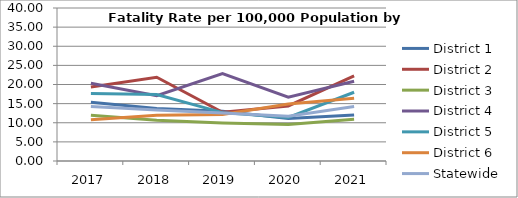
| Category | District 1 | District 2 | District 3 | District 4 | District 5 | District 6 | Statewide |
|---|---|---|---|---|---|---|---|
| 2017.0 | 15.329 | 19.351 | 11.976 | 20.334 | 17.663 | 10.802 | 14.269 |
| 2018.0 | 13.738 | 21.883 | 10.661 | 17.08 | 17.395 | 11.941 | 13.339 |
| 2019.0 | 13.015 | 12.753 | 9.921 | 22.882 | 12.645 | 12.181 | 12.535 |
| 2020.0 | 11.092 | 14.402 | 9.539 | 16.666 | 11.387 | 14.922 | 11.714 |
| 2021.0 | 12.058 | 22.239 | 10.931 | 20.855 | 17.975 | 16.412 | 14.256 |